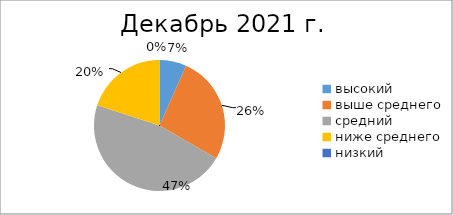
| Category | Series 0 |
|---|---|
| высокий | 1 |
| выше среднего | 4 |
| средний | 7 |
| ниже среднего | 3 |
| низкий | 0 |